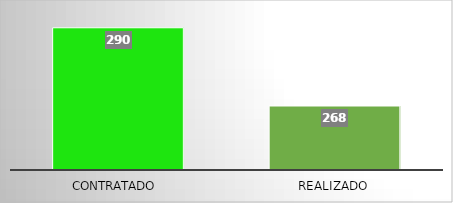
| Category | Series 0 |
|---|---|
| Contratado  | 290 |
| Realizado | 268 |